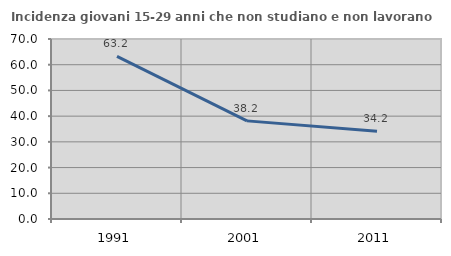
| Category | Incidenza giovani 15-29 anni che non studiano e non lavorano  |
|---|---|
| 1991.0 | 63.216 |
| 2001.0 | 38.16 |
| 2011.0 | 34.15 |